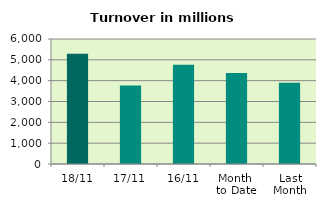
| Category | Series 0 |
|---|---|
| 18/11 | 5297.787 |
| 17/11 | 3773.202 |
| 16/11 | 4769.488 |
| Month 
to Date | 4369.942 |
| Last
Month | 3895.685 |